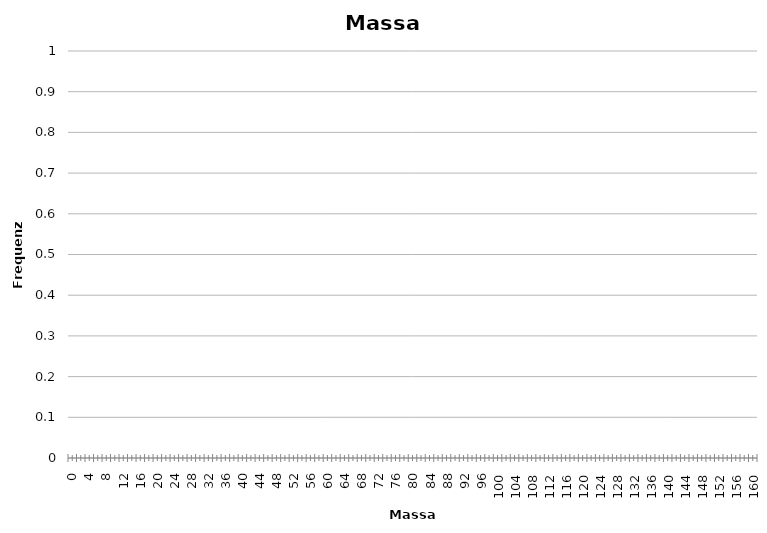
| Category | Series 0 |
|---|---|
| 0 | 0 |
| 2 | 0 |
| 4 | 0 |
| 6 | 1 |
| 8 | 0 |
| 10 | 0 |
| 12 | 0 |
| 14 | 0 |
| 16 | 0 |
| 18 | 0 |
| 20 | 0 |
| 22 | 0 |
| 24 | 0 |
| 26 | 0 |
| 28 | 0 |
| 30 | 0 |
| 32 | 0 |
| 34 | 0 |
| 36 | 0 |
| 38 | 0 |
| 40 | 0 |
| 42 | 0 |
| 44 | 0 |
| 46 | 0 |
| 48 | 0 |
| 50 | 0 |
| 52 | 0 |
| 54 | 0 |
| 56 | 0 |
| 58 | 0 |
| 60 | 0 |
| 62 | 0 |
| 64 | 0 |
| 66 | 0 |
| 68 | 0 |
| 70 | 0 |
| 72 | 0 |
| 74 | 0 |
| 76 | 0 |
| 78 | 0 |
| 80 | 0 |
| 82 | 0 |
| 84 | 0 |
| 86 | 0 |
| 88 | 0 |
| 90 | 0 |
| 92 | 0 |
| 94 | 0 |
| 96 | 0 |
| 98 | 0 |
| 100 | 0 |
| 102 | 0 |
| 104 | 0 |
| 106 | 0 |
| 108 | 0 |
| 110 | 0 |
| 112 | 0 |
| 114 | 0 |
| 116 | 0 |
| 118 | 0 |
| 120 | 0 |
| 122 | 0 |
| 124 | 0 |
| 126 | 0 |
| 128 | 0 |
| 130 | 0 |
| 132 | 0 |
| 134 | 0 |
| 136 | 0 |
| 138 | 0 |
| 140 | 0 |
| 142 | 0 |
| 144 | 0 |
| 146 | 0 |
| 148 | 0 |
| 150 | 0 |
| 152 | 0 |
| 154 | 0 |
| 156 | 0 |
| 158 | 0 |
| 160 | 0 |